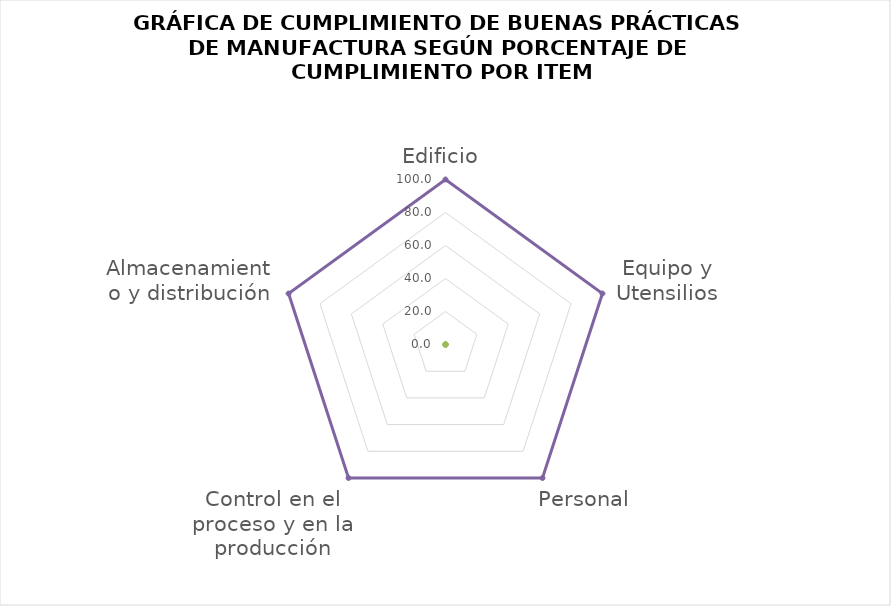
| Category | Series 2 | Series 3 |
|---|---|---|
| Edificio | 0 | 100 |
| Equipo y Utensilios | 0 | 100 |
| Personal | 0 | 100 |
| Control en el proceso y en la producción | 0 | 100 |
| Almacenamiento y distribución | 0 | 100 |